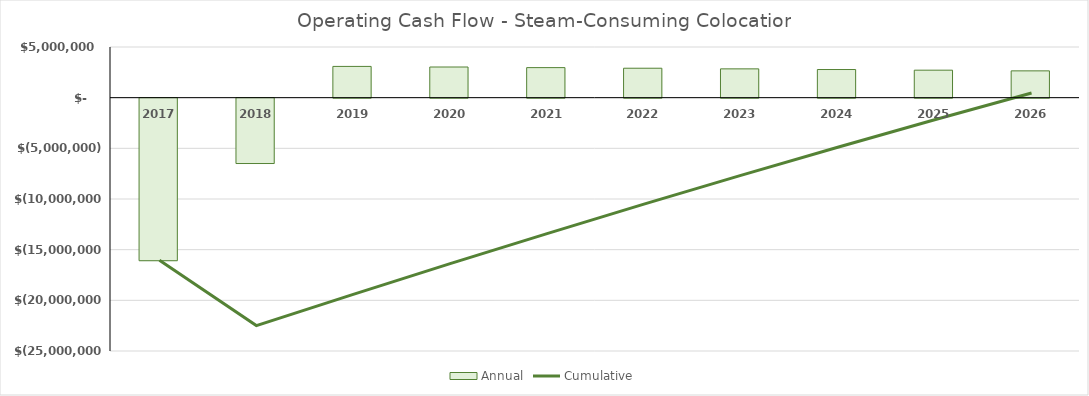
| Category | Annual |
|---|---|
| 2017.0 | -16040000 |
| 2018.0 | -6449776.875 |
| 2019.0 | 3083657.406 |
| 2020.0 | 3025448.841 |
| 2021.0 | 2965785.062 |
| 2022.0 | 2904629.689 |
| 2023.0 | 2841945.431 |
| 2024.0 | 2777694.067 |
| 2025.0 | 2711836.419 |
| 2026.0 | 2644332.329 |